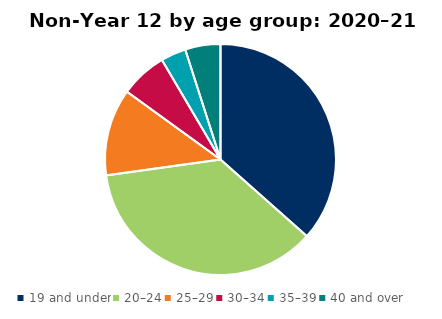
| Category | Series 0 |
|---|---|
| 19 and under | 7919 |
| 20–24 | 7851 |
| 25–29 | 2636 |
| 30–34 | 1421 |
| 35–39 | 764 |
| 40 and over | 1070 |